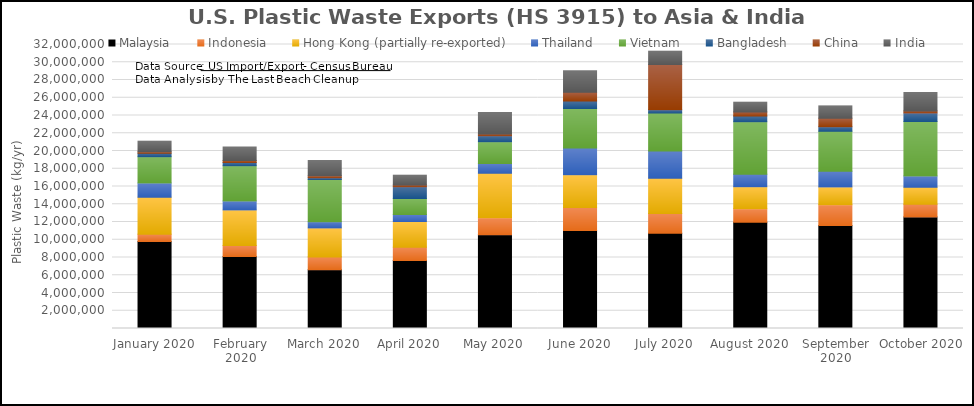
| Category | Malaysia | Indonesia | Hong Kong (partially re-exported) | Thailand | Vietnam | Bangladesh | China | India |
|---|---|---|---|---|---|---|---|---|
| January 2020 | 9794913 | 812516 | 4190000 | 1609918 | 2952747 | 377183 | 181029 | 1182766 |
| February 2020 | 8119799 | 1223506 | 4018602 | 1017832 | 3957361 | 361102 | 238785 | 1522321 |
| March 2020 | 6630085 | 1418844 | 3285239 | 697281 | 4757507 | 194634 | 226418 | 1716184 |
| April 2020 | 7659433 | 1483654 | 2902887 | 811069 | 1782737 | 1328958 | 188036 | 1113411 |
| May 2020 | 10558685 | 1909814 | 5029641 | 1102805 | 2444504 | 666714 | 192978 | 2434402 |
| June 2020 | 11055021 | 2583938 | 3693856 | 3004556 | 4441630 | 845386 | 1004670 | 2410645 |
| July 2020 | 10730335 | 2232633 | 3973162 | 3060974 | 4272568 | 384999 | 5104928 | 1473345 |
| August 2020 | 11963085 | 1538775 | 2476151 | 1398693 | 5914623 | 644606 | 451857 | 1108908 |
| September 2020 | 11606282 | 2341492 | 2007522 | 1761535 | 4513457 | 502847 | 958261 | 1372212 |
| October 2020 | 12574324 | 1420760 | 1924892 | 1271667 | 6140044 | 958342 | 217202 | 2089156 |